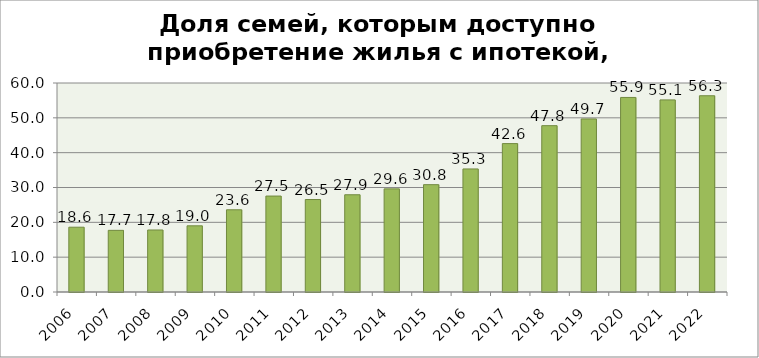
| Category | Series 0 |
|---|---|
| 2006 | 18.6 |
| 2007 | 17.7 |
| 2008 | 17.8 |
| 2009 | 19 |
| 2010 | 23.6 |
| 2011 | 27.543 |
| 2012 | 26.55 |
| 2013 | 27.916 |
| 2014 | 29.608 |
| 2015 | 30.813 |
| 2016 | 35.327 |
| 2017 | 42.604 |
| 2018 | 47.752 |
| 2019 | 49.681 |
| 2020 | 55.852 |
| 2021 | 55.148 |
| 2022 | 56.343 |